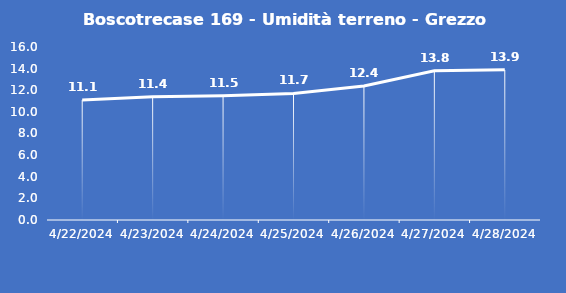
| Category | Boscotrecase 169 - Umidità terreno - Grezzo (%VWC) |
|---|---|
| 4/22/24 | 11.1 |
| 4/23/24 | 11.4 |
| 4/24/24 | 11.5 |
| 4/25/24 | 11.7 |
| 4/26/24 | 12.4 |
| 4/27/24 | 13.8 |
| 4/28/24 | 13.9 |